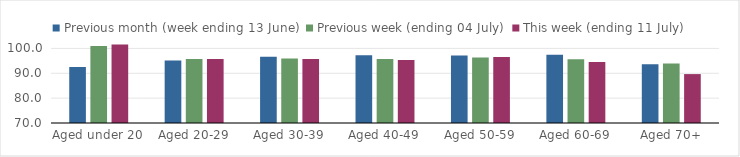
| Category | Previous month (week ending 13 June) | Previous week (ending 04 July) | This week (ending 11 July) |
|---|---|---|---|
| Aged under 20 | 92.514 | 101.024 | 101.608 |
| Aged 20-29 | 95.19 | 95.762 | 95.786 |
| Aged 30-39 | 96.636 | 95.917 | 95.709 |
| Aged 40-49 | 97.224 | 95.751 | 95.348 |
| Aged 50-59 | 97.134 | 96.39 | 96.592 |
| Aged 60-69 | 97.44 | 95.615 | 94.578 |
| Aged 70+ | 93.624 | 93.96 | 89.678 |